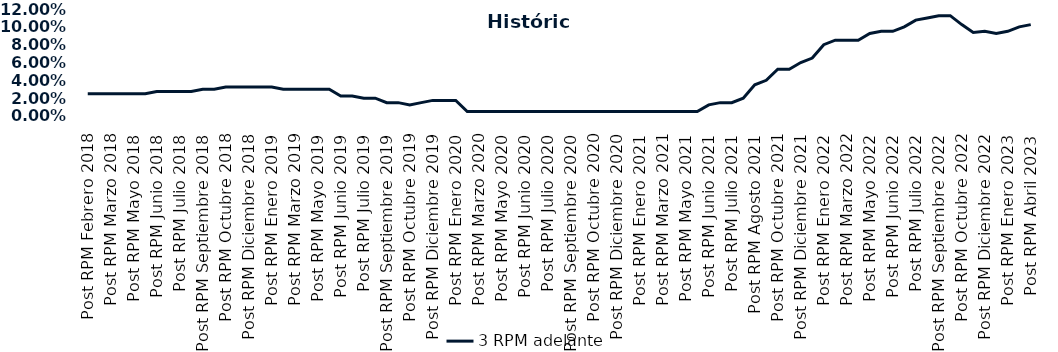
| Category | 3 RPM adelante |
|---|---|
| Post RPM Febrero 2018 | 0.025 |
| Pre RPM Marzo 2018 | 0.025 |
| Post RPM Marzo 2018 | 0.025 |
| Pre RPM Mayo 2018 | 0.025 |
| Post RPM Mayo 2018 | 0.025 |
| Pre RPM Junio 2018 | 0.025 |
| Post RPM Junio 2018 | 0.028 |
| Pre RPM Julio 2018 | 0.028 |
| Post RPM Julio 2018 | 0.028 |
| Pre RPM Septiembre 2018 | 0.028 |
| Post RPM Septiembre 2018 | 0.03 |
| Pre RPM Octubre 2018 | 0.03 |
| Post RPM Octubre 2018 | 0.032 |
| Pre RPM Diciembre 2018 | 0.032 |
| Post RPM Diciembre 2018 | 0.032 |
| Pre RPM Enero 2019 | 0.032 |
| Post RPM Enero 2019 | 0.032 |
| Pre RPM Marzo 2019 | 0.03 |
| Post RPM Marzo 2019 | 0.03 |
| Pre RPM Mayo 2019 | 0.03 |
| Post RPM Mayo 2019 | 0.03 |
| Pre RPM Junio 2019 | 0.03 |
| Post RPM Junio 2019 | 0.022 |
| Pre RPM Julio 2019 | 0.022 |
| Post RPM Julio 2019 | 0.02 |
| Pre RPM Septiembre 2019 | 0.02 |
| Post RPM Septiembre 2019 | 0.015 |
| Pre RPM Octubre 2019 | 0.015 |
| Post RPM Octubre 2019 | 0.012 |
| Pre RPM Diciembre 2019 | 0.015 |
| Post RPM Diciembre 2019 | 0.018 |
| Pre RPM Enero 2020 | 0.018 |
| Post RPM Enero 2020 | 0.018 |
| Pre RPM Marzo 2020 | 0.005 |
| Post RPM Marzo 2020 | 0.005 |
| Pre RPM Mayo 2020 | 0.005 |
| Post RPM Mayo 2020 | 0.005 |
| Pre RPM Junio 2020 | 0.005 |
| Post RPM Junio 2020 | 0.005 |
| Pre RPM Julio 2020 | 0.005 |
| Post RPM Julio 2020 | 0.005 |
| Pre RPM Septiembre 2020 | 0.005 |
| Post RPM Septiembre 2020 | 0.005 |
| Pre RPM Octubre 2020 | 0.005 |
| Post RPM Octubre 2020 | 0.005 |
| Pre RPM Diciembre 2020 | 0.005 |
| Post RPM Diciembre 2020 | 0.005 |
| Pre RPM Enero 2021 | 0.005 |
| Post RPM Enero 2021 | 0.005 |
| Pre RPM Marzo 2021 | 0.005 |
| Post RPM Marzo 2021 | 0.005 |
| Pre RPM Mayo 2021 | 0.005 |
| Post RPM Mayo 2021 | 0.005 |
| Pre RPM Junio 2021 | 0.005 |
| Post RPM Junio 2021 | 0.012 |
| Pre RPM Julio 2021 | 0.015 |
| Post RPM Julio 2021 | 0.015 |
| Pre RPM Agosto 2021 | 0.02 |
| Post RPM Agosto 2021 | 0.035 |
| Pre RPM Octubre 2021 | 0.04 |
| Post RPM Octubre 2021 | 0.052 |
| Pre RPM Diciembre 2021 | 0.052 |
| Post RPM Diciembre 2021 | 0.06 |
| Pre RPM Enero 2022 | 0.065 |
| Post RPM Enero 2022 | 0.08 |
| Pre RPM Marzo 2022 | 0.085 |
| Post RPM Marzo 2022 | 0.085 |
| Pre RPM Mayo 2022 | 0.085 |
| Post RPM Mayo 2022 | 0.092 |
| Pre RPM Junio 2022 | 0.095 |
| Post RPM Junio 2022 | 0.095 |
| Pre RPM Julio 2022 | 0.1 |
| Post RPM Julio 2022 | 0.108 |
| Pre RPM Septiembre 2022 | 0.11 |
| Post RPM Septiembre 2022 | 0.112 |
| Pre RPM Octubre 2022 | 0.112 |
| Post RPM Octubre 2022 | 0.102 |
| Pre RPM Diciembre 2022 | 0.094 |
| Post RPM Diciembre 2022 | 0.095 |
| Pre RPM Enero 2023 | 0.092 |
| Post RPM Enero 2023 | 0.095 |
| Pre RPM Abril 2023 | 0.1 |
| Post RPM Abril 2023 | 0.102 |